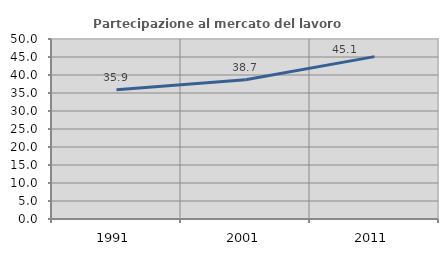
| Category | Partecipazione al mercato del lavoro  femminile |
|---|---|
| 1991.0 | 35.891 |
| 2001.0 | 38.653 |
| 2011.0 | 45.1 |